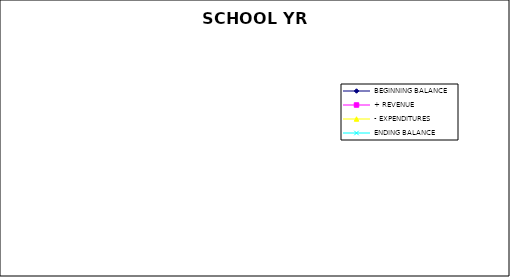
| Category | BEGINNING BALANCE | + REVENUE | - EXPENDITURES | ENDING BALANCE |
|---|---|---|---|---|
| 0 | 531020.02 | 790.41 | 11036.63 | 520773.8 |
| 1 | 520773.8 | -2199.12 | 4596.05 | 513978.63 |
| 2 | 513978.63 | 3551.04 | 29047.74 | 488481.93 |
| 3 | 488481.93 | 7999.93 | 3995.33 | 492486.53 |
| 4 | 492486.53 | 104146.11 | 140513.96 | 456118.68 |
| 5 | 456118.68 | 32911.59 | 35701.68 | 453328.59 |
| 6 | 453328.59 | 302.08 | 4465.26 | 449165.41 |
| 7 | 449165.41 | 10997.19 | 2239 | 457923.6 |
| 8 | 457923.6 | 1327.78 | 68388.17 | 390863.21 |
| 9 | 390863.21 | 19101.14 | 1961.5 | 408002.85 |
| 10 | 408002.85 | 96478.51 | 2189.35 | 502292.01 |
| 11 | 502292.01 | 51428.65 | 24731.49 | 528989.17 |